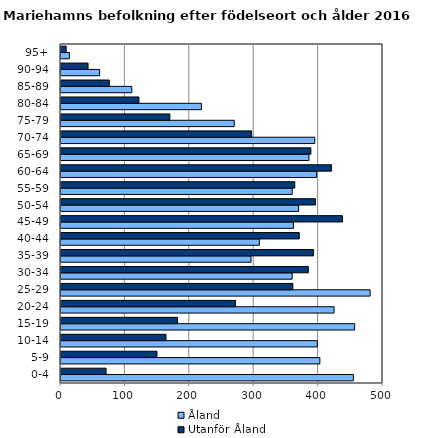
| Category | Åland | Utanför Åland |
|---|---|---|
| 0-4 | 454 | 70 |
| 5-9 | 402 | 149 |
| 10-14 | 398 | 163 |
| 15-19 | 456 | 181 |
| 20-24 | 424 | 271 |
| 25-29 | 480 | 360 |
| 30-34 | 359 | 384 |
| 35-39 | 295 | 392 |
| 40-44 | 308 | 370 |
| 45-49 | 361 | 437 |
| 50-54 | 369 | 395 |
| 55-59 | 359 | 363 |
| 60-64 | 397 | 420 |
| 65-69 | 385 | 388 |
| 70-74 | 394 | 296 |
| 75-79 | 269 | 169 |
| 80-84 | 218 | 121 |
| 85-89 | 110 | 75 |
| 90-94 | 60 | 42 |
| 95+ | 13 | 8 |